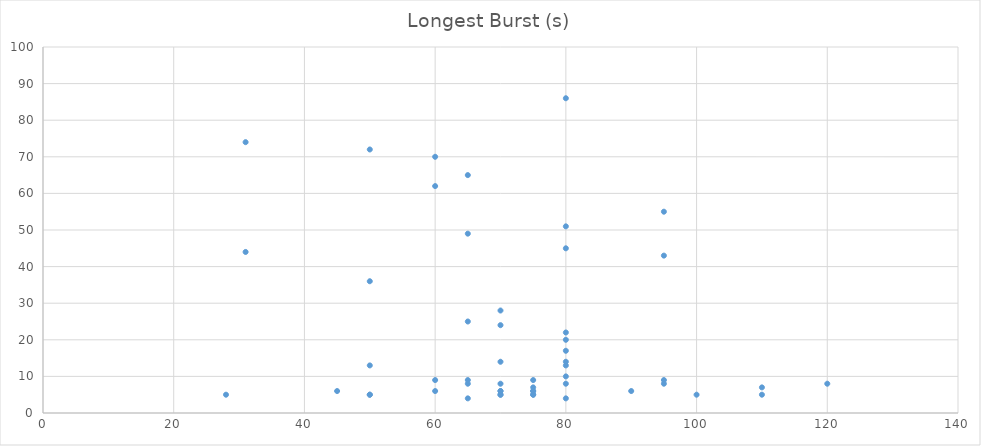
| Category | Longest Burst (s) |
|---|---|
| 65.0 | 65 |
| 65.0 | 49 |
| 65.0 | 25 |
| 80.0 | 20 |
| 28.0 | 5 |
| 75.0 | 5 |
| 65.0 | 8 |
| 65.0 | 4 |
| 50.0 | 5 |
| 70.0 | 24 |
| 75.0 | 5 |
| 45.0 | 6 |
| 80.0 | 17 |
| 80.0 | 10 |
| 75.0 | 6 |
| 75.0 | 7 |
| 65.0 | 9 |
| 80.0 | 86 |
| 80.0 | 51 |
| 31.0 | 44 |
| 31.0 | 74 |
| 95.0 | 8 |
| 70.0 | 6 |
| 75.0 | 6 |
| 75.0 | 9 |
| 70.0 | 28 |
| 60.0 | 6 |
| 80.0 | 4 |
| 60.0 | 62 |
| 60.0 | 9 |
| 60.0 | 70 |
| 80.0 | 8 |
| 95.0 | 43 |
| 80.0 | 45 |
| 95.0 | 9 |
| 50.0 | 5 |
| 50.0 | 36 |
| 50.0 | 72 |
| 50.0 | 13 |
| 70.0 | 8 |
| 80.0 | 22 |
| 70.0 | 6 |
| 70.0 | 14 |
| 70.0 | 5 |
| 95.0 | 55 |
| 100.0 | 5 |
| 70.0 | 5 |
| 90.0 | 6 |
| 110.0 | 7 |
| 120.0 | 8 |
| 110.0 | 5 |
| 80.0 | 14 |
| 80.0 | 13 |